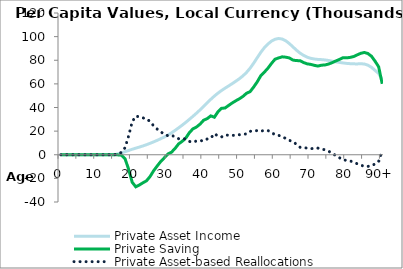
| Category | Private Asset Income | Private Saving | Private Asset-based Reallocations |
|---|---|---|---|
| 0 | 0 | 25.315 | -25.315 |
|  | 0 | 26.794 | -26.794 |
| 2 | 0 | 28.968 | -28.968 |
| 3 | 0 | 30.806 | -30.806 |
| 4 | 0 | 31.621 | -31.621 |
| 5 | 0 | 32.245 | -32.245 |
| 6 | 0 | 32.944 | -32.944 |
| 7 | 0 | 33.773 | -33.773 |
| 8 | 0 | 34.913 | -34.913 |
| 9 | 0 | 35.883 | -35.883 |
| 10 | 0 | 36.857 | -36.857 |
| 11 | 0 | 37.883 | -37.883 |
| 12 | 0 | 39.368 | -39.368 |
| 13 | 0 | 41.181 | -41.181 |
| 14 | 0 | 43.598 | -43.598 |
| 15 | 0 | 46.684 | -46.684 |
| 16 | 760.331 | -112.543 | 872.874 |
| 17 | 1566.506 | -399.924 | 1966.43 |
| 18 | 2602.264 | -3372.997 | 5975.261 |
| 19 | 3630.03 | -12396.729 | 16026.759 |
| 20 | 4644.05 | -23303.533 | 27947.583 |
| 21 | 5586.139 | -27160.191 | 32746.331 |
| 22 | 6489.475 | -25604.296 | 32093.771 |
| 23 | 7451.209 | -23739.835 | 31191.044 |
| 24 | 8507.865 | -22061.041 | 30568.905 |
| 25 | 9670.437 | -18425.223 | 28095.66 |
| 26 | 10911.875 | -13545.416 | 24457.291 |
| 27 | 12212.192 | -9486.694 | 21698.886 |
| 28 | 13581.595 | -5643.823 | 19225.418 |
| 29 | 15039.585 | -2554.935 | 17594.52 |
| 30 | 16670.086 | 638.282 | 16031.804 |
| 31 | 18530.346 | 2165.196 | 16365.149 |
| 32 | 20603.35 | 5332.882 | 15270.468 |
| 33 | 22803.895 | 9213.002 | 13590.893 |
| 34 | 25053.659 | 11372.919 | 13680.739 |
| 35 | 27422.721 | 14117.18 | 13305.542 |
| 36 | 29935.579 | 18662.602 | 11272.976 |
| 37 | 32532.954 | 21926.631 | 10606.322 |
| 38 | 35196.463 | 23484.878 | 11711.585 |
| 39 | 37974.959 | 25925.285 | 12049.673 |
| 40 | 40888.763 | 29263.122 | 11625.642 |
| 41 | 43924.375 | 30564.357 | 13360.019 |
| 42 | 46907.437 | 32918.59 | 13988.847 |
| 43 | 49666.362 | 31764.593 | 17901.769 |
| 44 | 52134.141 | 36305.484 | 15828.657 |
| 45 | 54358.454 | 39278.357 | 15080.097 |
| 46 | 56369.55 | 39588.877 | 16780.673 |
| 47 | 58266.929 | 41759.846 | 16507.082 |
| 48 | 60211.397 | 43822.628 | 16388.768 |
| 49 | 62235.614 | 45691.057 | 16544.557 |
| 50 | 64342.029 | 47359.697 | 16982.332 |
| 51 | 66750.439 | 49376.601 | 17373.838 |
| 52 | 69672.164 | 52034.81 | 17637.353 |
| 53 | 73228.373 | 53424.84 | 19803.533 |
| 54 | 77471.387 | 57260.994 | 20210.393 |
| 55 | 82142.723 | 61704.158 | 20438.565 |
| 56 | 86692.196 | 66867.716 | 19824.481 |
| 57 | 90634.842 | 69922.611 | 20712.231 |
| 58 | 93740.522 | 73281.696 | 20458.827 |
| 59 | 96186.713 | 77307.286 | 18879.427 |
| 60 | 97798.867 | 80918.607 | 16880.26 |
| 61 | 98416.391 | 81963.905 | 16452.487 |
| 62 | 97965.811 | 82899.714 | 15066.096 |
| 63 | 96464.259 | 82593.181 | 13871.078 |
| 64 | 94119.544 | 81966.668 | 12152.877 |
| 65 | 91306.485 | 80150.339 | 11156.146 |
| 66 | 88495.662 | 79691.127 | 8804.535 |
| 67 | 86013.095 | 79659.869 | 6353.226 |
| 68 | 84075.891 | 78015.418 | 6060.473 |
| 69 | 82581.195 | 76963.48 | 5617.715 |
| 70 | 81617.164 | 76491.187 | 5125.977 |
| 71 | 81041.624 | 75675.73 | 5365.894 |
| 72 | 80682.687 | 75087.578 | 5595.109 |
| 73 | 80528.432 | 75800.828 | 4727.604 |
| 74 | 80245.725 | 76022.515 | 4223.21 |
| 75 | 79790.806 | 76810.678 | 2980.127 |
| 76 | 79199.341 | 77972.431 | 1226.91 |
| 77 | 78635.97 | 79378.518 | -742.548 |
| 78 | 78196.695 | 80676.536 | -2479.841 |
| 79 | 77734.759 | 82115.139 | -4380.379 |
| 80 | 77350.583 | 82028.633 | -4678.05 |
| 81 | 77111.175 | 82405.616 | -5294.441 |
| 82 | 76945.165 | 83130.807 | -6185.642 |
| 83 | 76900.511 | 84545.195 | -7644.684 |
| 84 | 77045.445 | 85877.969 | -8832.524 |
| 85 | 76814.047 | 86583.115 | -9769.068 |
| 86 | 75833.907 | 85693.381 | -9859.474 |
| 87 | 74000.596 | 83366.19 | -9365.594 |
| 88 | 71409.068 | 79177.816 | -7768.748 |
| 89 | 68797.088 | 74497.074 | -5699.986 |
| 90+ | 63406.437 | 60017.709 | 3388.728 |